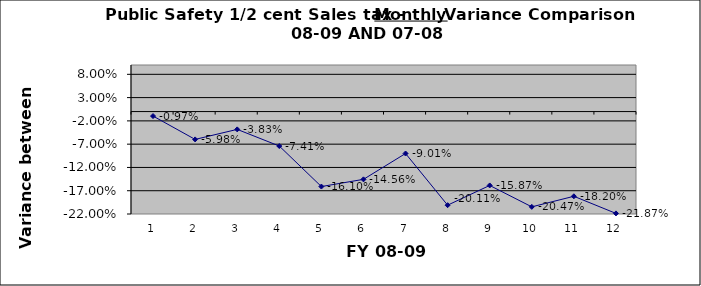
| Category | September October November December January February March April May June  July August |
|---|---|
| 0 | -0.01 |
| 1 | -0.06 |
| 2 | -0.038 |
| 3 | -0.074 |
| 4 | -0.161 |
| 5 | -0.146 |
| 6 | -0.09 |
| 7 | -0.201 |
| 8 | -0.159 |
| 9 | -0.205 |
| 10 | -0.182 |
| 11 | -0.219 |